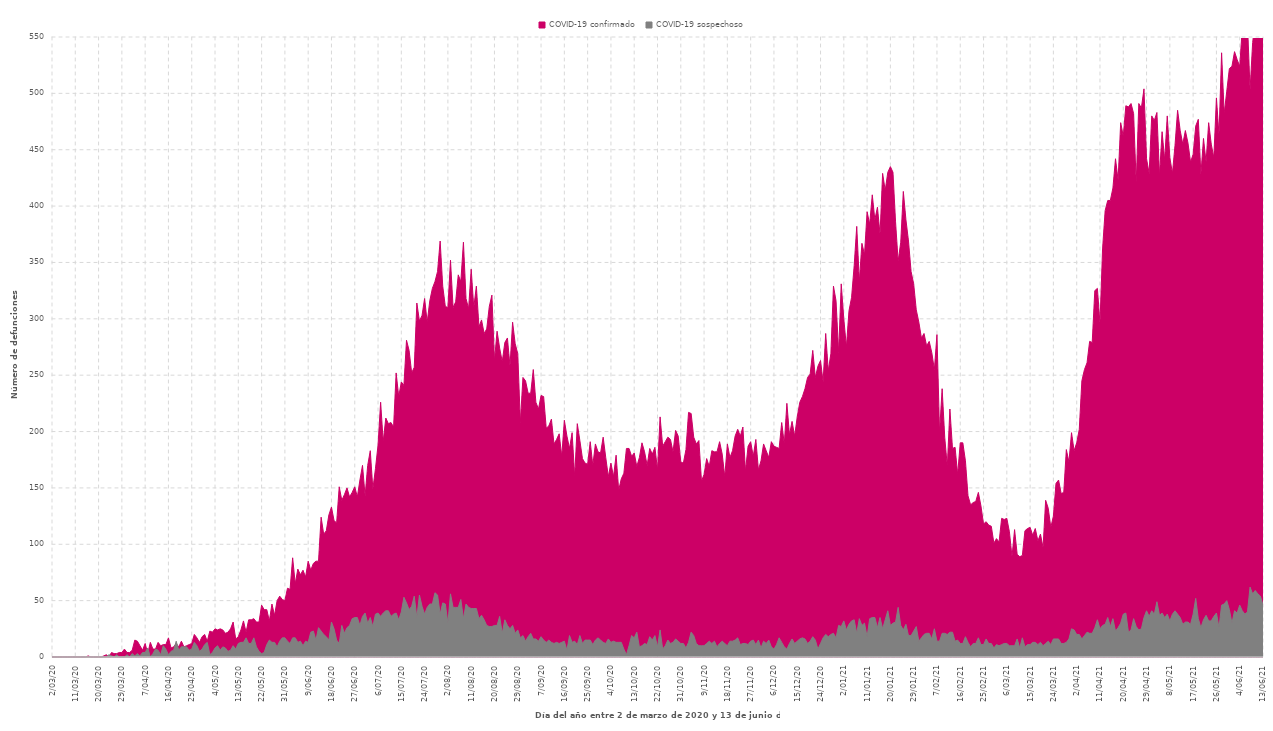
| Category | COVID-19 confirmado | COVID-19 sospechoso |
|---|---|---|
| 2020-03-02 | 0 | 0 |
| 2020-03-03 | 0 | 0 |
| 2020-03-04 | 0 | 0 |
| 2020-03-05 | 0 | 0 |
| 2020-03-06 | 0 | 0 |
| 2020-03-07 | 0 | 0 |
| 2020-03-08 | 0 | 0 |
| 2020-03-09 | 0 | 0 |
| 2020-03-10 | 0 | 0 |
| 2020-03-11 | 0 | 0 |
| 2020-03-12 | 0 | 0 |
| 2020-03-13 | 0 | 0 |
| 2020-03-14 | 0 | 0 |
| 2020-03-15 | 0 | 0 |
| 2020-03-16 | 1 | 0 |
| 2020-03-17 | 0 | 0 |
| 2020-03-18 | 0 | 0 |
| 2020-03-19 | 0 | 0 |
| 2020-03-20 | 0 | 0 |
| 2020-03-21 | 0 | 0 |
| 2020-03-22 | 1 | 0 |
| 2020-03-23 | 2 | 0 |
| 2020-03-24 | 0 | 2 |
| 2020-03-25 | 4 | 1 |
| 2020-03-26 | 3 | 0 |
| 2020-03-27 | 3 | 2 |
| 2020-03-28 | 4 | 0 |
| 2020-03-29 | 4 | 0 |
| 2020-03-30 | 7 | 0 |
| 2020-03-31 | 4 | 2 |
| 2020-04-01 | 4 | 0 |
| 2020-04-02 | 6 | 3 |
| 2020-04-03 | 15 | 1 |
| 2020-04-04 | 14 | 3 |
| 2020-04-05 | 10 | 1 |
| 2020-04-06 | 6 | 4 |
| 2020-04-07 | 12 | 4 |
| 2020-04-08 | 3 | 8 |
| 2020-04-09 | 13 | 0 |
| 2020-04-10 | 7 | 3 |
| 2020-04-11 | 7 | 7 |
| 2020-04-12 | 13 | 6 |
| 2020-04-13 | 10 | 2 |
| 2020-04-14 | 11 | 10 |
| 2020-04-15 | 11 | 7 |
| 2020-04-16 | 17 | 2 |
| 2020-04-17 | 8 | 5 |
| 2020-04-18 | 9 | 6 |
| 2020-04-19 | 12 | 14 |
| 2020-04-20 | 9 | 6 |
| 2020-04-21 | 14 | 9 |
| 2020-04-22 | 9 | 9 |
| 2020-04-23 | 10 | 9 |
| 2020-04-24 | 11 | 6 |
| 2020-04-25 | 12 | 7 |
| 2020-04-26 | 20 | 13 |
| 2020-04-27 | 17 | 10 |
| 2020-04-28 | 13 | 5 |
| 2020-04-29 | 18 | 7 |
| 2020-04-30 | 20 | 11 |
| 2020-05-01 | 14 | 13 |
| 2020-05-02 | 23 | 2 |
| 2020-05-03 | 22 | 4 |
| 2020-05-04 | 25 | 8 |
| 2020-05-05 | 24 | 10 |
| 2020-05-06 | 25 | 6 |
| 2020-05-07 | 24 | 9 |
| 2020-05-08 | 21 | 8 |
| 2020-05-09 | 22 | 5 |
| 2020-05-10 | 25 | 6 |
| 2020-05-11 | 31 | 10 |
| 2020-05-12 | 16 | 7 |
| 2020-05-13 | 18 | 12 |
| 2020-05-14 | 24 | 13 |
| 2020-05-15 | 32 | 13 |
| 2020-05-16 | 22 | 17 |
| 2020-05-17 | 33 | 12 |
| 2020-05-18 | 33 | 12 |
| 2020-05-19 | 34 | 17 |
| 2020-05-20 | 31 | 9 |
| 2020-05-21 | 31 | 5 |
| 2020-05-22 | 46 | 3 |
| 2020-05-23 | 42 | 4 |
| 2020-05-24 | 42 | 11 |
| 2020-05-25 | 32 | 15 |
| 2020-05-26 | 47 | 13 |
| 2020-05-27 | 37 | 13 |
| 2020-05-28 | 50 | 9 |
| 2020-05-29 | 54 | 14 |
| 2020-05-30 | 51 | 17 |
| 2020-05-31 | 50 | 17 |
| 2020-06-01 | 61 | 14 |
| 2020-06-02 | 60 | 12 |
| 2020-06-03 | 88 | 17 |
| 2020-06-04 | 65 | 17 |
| 2020-06-05 | 78 | 13 |
| 2020-06-06 | 73 | 14 |
| 2020-06-07 | 77 | 10 |
| 2020-06-08 | 71 | 14 |
| 2020-06-09 | 85 | 13 |
| 2020-06-10 | 77 | 22 |
| 2020-06-11 | 83 | 23 |
| 2020-06-12 | 85 | 15 |
| 2020-06-13 | 85 | 26 |
| 2020-06-14 | 124 | 23 |
| 2020-06-15 | 109 | 20 |
| 2020-06-16 | 112 | 18 |
| 2020-06-17 | 126 | 15 |
| 2020-06-18 | 133 | 31 |
| 2020-06-19 | 121 | 25 |
| 2020-06-20 | 119 | 15 |
| 2020-06-21 | 151 | 12 |
| 2020-06-22 | 139 | 28 |
| 2020-06-23 | 144 | 21 |
| 2020-06-24 | 150 | 26 |
| 2020-06-25 | 142 | 28 |
| 2020-06-26 | 146 | 34 |
| 2020-06-27 | 151 | 35 |
| 2020-06-28 | 142 | 35 |
| 2020-06-29 | 157 | 28 |
| 2020-06-30 | 170 | 36 |
| 2020-07-01 | 143 | 39 |
| 2020-07-02 | 170 | 30 |
| 2020-07-03 | 183 | 35 |
| 2020-07-04 | 149 | 27 |
| 2020-07-05 | 167 | 38 |
| 2020-07-06 | 188 | 39 |
| 2020-07-07 | 226 | 36 |
| 2020-07-08 | 191 | 39 |
| 2020-07-09 | 212 | 41 |
| 2020-07-10 | 207 | 41 |
| 2020-07-11 | 208 | 36 |
| 2020-07-12 | 204 | 38 |
| 2020-07-13 | 252 | 39 |
| 2020-07-14 | 231 | 33 |
| 2020-07-15 | 244 | 40 |
| 2020-07-16 | 241 | 53 |
| 2020-07-17 | 281 | 48 |
| 2020-07-18 | 272 | 42 |
| 2020-07-19 | 252 | 45 |
| 2020-07-20 | 257 | 54 |
| 2020-07-21 | 314 | 35 |
| 2020-07-22 | 298 | 55 |
| 2020-07-23 | 303 | 45 |
| 2020-07-24 | 318 | 38 |
| 2020-07-25 | 297 | 44 |
| 2020-07-26 | 316 | 47 |
| 2020-07-27 | 327 | 47 |
| 2020-07-28 | 333 | 57 |
| 2020-07-29 | 342 | 55 |
| 2020-07-30 | 369 | 38 |
| 2020-07-31 | 329 | 48 |
| 2020-08-01 | 311 | 47 |
| 2020-08-02 | 310 | 30 |
| 2020-08-03 | 352 | 56 |
| 2020-08-04 | 310 | 44 |
| 2020-08-05 | 315 | 44 |
| 2020-08-06 | 339 | 44 |
| 2020-08-07 | 333 | 51 |
| 2020-08-08 | 368 | 34 |
| 2020-08-09 | 318 | 47 |
| 2020-08-10 | 309 | 44 |
| 2020-08-11 | 344 | 43 |
| 2020-08-12 | 310 | 43 |
| 2020-08-13 | 329 | 43 |
| 2020-08-14 | 293 | 34 |
| 2020-08-15 | 299 | 37 |
| 2020-08-16 | 287 | 33 |
| 2020-08-17 | 291 | 28 |
| 2020-08-18 | 311 | 27 |
| 2020-08-19 | 321 | 27 |
| 2020-08-20 | 263 | 28 |
| 2020-08-21 | 289 | 28 |
| 2020-08-22 | 274 | 36 |
| 2020-08-23 | 262 | 21 |
| 2020-08-24 | 279 | 33 |
| 2020-08-25 | 283 | 28 |
| 2020-08-26 | 258 | 25 |
| 2020-08-27 | 297 | 28 |
| 2020-08-28 | 278 | 21 |
| 2020-08-29 | 269 | 24 |
| 2020-08-30 | 208 | 17 |
| 2020-08-31 | 248 | 19 |
| 2020-09-01 | 245 | 14 |
| 2020-09-02 | 234 | 18 |
| 2020-09-03 | 234 | 21 |
| 2020-09-04 | 255 | 16 |
| 2020-09-05 | 226 | 16 |
| 2020-09-06 | 220 | 14 |
| 2020-09-07 | 232 | 18 |
| 2020-09-08 | 231 | 15 |
| 2020-09-09 | 203 | 13 |
| 2020-09-10 | 205 | 15 |
| 2020-09-11 | 211 | 13 |
| 2020-09-12 | 189 | 12 |
| 2020-09-13 | 193 | 13 |
| 2020-09-14 | 198 | 12 |
| 2020-09-15 | 178 | 13 |
| 2020-09-16 | 210 | 14 |
| 2020-09-17 | 196 | 6 |
| 2020-09-18 | 185 | 19 |
| 2020-09-19 | 199 | 13 |
| 2020-09-20 | 160 | 14 |
| 2020-09-21 | 207 | 11 |
| 2020-09-22 | 192 | 19 |
| 2020-09-23 | 176 | 12 |
| 2020-09-24 | 172 | 15 |
| 2020-09-25 | 171 | 15 |
| 2020-09-26 | 191 | 15 |
| 2020-09-27 | 170 | 11 |
| 2020-09-28 | 189 | 15 |
| 2020-09-29 | 182 | 17 |
| 2020-09-30 | 181 | 15 |
| 2020-10-01 | 195 | 13 |
| 2020-10-02 | 177 | 12 |
| 2020-10-03 | 160 | 16 |
| 2020-10-04 | 172 | 13 |
| 2020-10-05 | 160 | 14 |
| 2020-10-06 | 179 | 13 |
| 2020-10-07 | 148 | 13 |
| 2020-10-08 | 158 | 13 |
| 2020-10-09 | 163 | 7 |
| 2020-10-10 | 185 | 2 |
| 2020-10-11 | 185 | 10 |
| 2020-10-12 | 178 | 19 |
| 2020-10-13 | 181 | 17 |
| 2020-10-14 | 169 | 22 |
| 2020-10-15 | 177 | 9 |
| 2020-10-16 | 190 | 10 |
| 2020-10-17 | 182 | 12 |
| 2020-10-18 | 170 | 11 |
| 2020-10-19 | 185 | 18 |
| 2020-10-20 | 180 | 15 |
| 2020-10-21 | 186 | 19 |
| 2020-10-22 | 166 | 9 |
| 2020-10-23 | 213 | 24 |
| 2020-10-24 | 187 | 7 |
| 2020-10-25 | 191 | 10 |
| 2020-10-26 | 195 | 15 |
| 2020-10-27 | 193 | 12 |
| 2020-10-28 | 182 | 13 |
| 2020-10-29 | 201 | 16 |
| 2020-10-30 | 196 | 14 |
| 2020-10-31 | 173 | 12 |
| 2020-11-01 | 172 | 12 |
| 2020-11-02 | 184 | 8 |
| 2020-11-03 | 217 | 13 |
| 2020-11-04 | 216 | 22 |
| 2020-11-05 | 195 | 19 |
| 2020-11-06 | 189 | 12 |
| 2020-11-07 | 192 | 10 |
| 2020-11-08 | 156 | 10 |
| 2020-11-09 | 162 | 10 |
| 2020-11-10 | 176 | 12 |
| 2020-11-11 | 169 | 14 |
| 2020-11-12 | 183 | 12 |
| 2020-11-13 | 182 | 14 |
| 2020-11-14 | 182 | 9 |
| 2020-11-15 | 191 | 12 |
| 2020-11-16 | 180 | 14 |
| 2020-11-17 | 160 | 12 |
| 2020-11-18 | 189 | 10 |
| 2020-11-19 | 177 | 14 |
| 2020-11-20 | 183 | 14 |
| 2020-11-21 | 196 | 15 |
| 2020-11-22 | 202 | 17 |
| 2020-11-23 | 196 | 11 |
| 2020-11-24 | 204 | 12 |
| 2020-11-25 | 165 | 12 |
| 2020-11-26 | 187 | 11 |
| 2020-11-27 | 191 | 14 |
| 2020-11-28 | 178 | 15 |
| 2020-11-29 | 193 | 11 |
| 2020-11-30 | 166 | 15 |
| 2020-12-01 | 174 | 8 |
| 2020-12-02 | 189 | 14 |
| 2020-12-03 | 183 | 12 |
| 2020-12-04 | 177 | 15 |
| 2020-12-05 | 191 | 9 |
| 2020-12-06 | 187 | 7 |
| 2020-12-07 | 186 | 11 |
| 2020-12-08 | 185 | 17 |
| 2020-12-09 | 208 | 13 |
| 2020-12-10 | 189 | 9 |
| 2020-12-11 | 225 | 7 |
| 2020-12-12 | 197 | 12 |
| 2020-12-13 | 209 | 16 |
| 2020-12-14 | 196 | 12 |
| 2020-12-15 | 213 | 14 |
| 2020-12-16 | 226 | 16 |
| 2020-12-17 | 231 | 17 |
| 2020-12-18 | 238 | 16 |
| 2020-12-19 | 248 | 12 |
| 2020-12-20 | 251 | 14 |
| 2020-12-21 | 272 | 18 |
| 2020-12-22 | 248 | 15 |
| 2020-12-23 | 258 | 7 |
| 2020-12-24 | 263 | 12 |
| 2020-12-25 | 244 | 17 |
| 2020-12-26 | 287 | 20 |
| 2020-12-27 | 254 | 18 |
| 2020-12-28 | 269 | 20 |
| 2020-12-29 | 329 | 21 |
| 2020-12-30 | 316 | 17 |
| 2020-12-31 | 270 | 28 |
| 2021-01-01 | 331 | 27 |
| 2021-01-02 | 300 | 32 |
| 2021-01-03 | 275 | 24 |
| 2021-01-04 | 307 | 29 |
| 2021-01-05 | 319 | 32 |
| 2021-01-06 | 347 | 33 |
| 2021-01-07 | 382 | 21 |
| 2021-01-08 | 333 | 34 |
| 2021-01-09 | 367 | 28 |
| 2021-01-10 | 357 | 30 |
| 2021-01-11 | 395 | 18 |
| 2021-01-12 | 384 | 34 |
| 2021-01-13 | 410 | 35 |
| 2021-01-14 | 388 | 35 |
| 2021-01-15 | 399 | 26 |
| 2021-01-16 | 375 | 35 |
| 2021-01-17 | 429 | 25 |
| 2021-01-18 | 414 | 33 |
| 2021-01-19 | 430 | 41 |
| 2021-01-20 | 435 | 28 |
| 2021-01-21 | 430 | 30 |
| 2021-01-22 | 386 | 31 |
| 2021-01-23 | 351 | 44 |
| 2021-01-24 | 368 | 28 |
| 2021-01-25 | 413 | 24 |
| 2021-01-26 | 388 | 29 |
| 2021-01-27 | 369 | 19 |
| 2021-01-28 | 342 | 19 |
| 2021-01-29 | 331 | 23 |
| 2021-01-30 | 308 | 27 |
| 2021-01-31 | 297 | 14 |
| 2021-02-01 | 283 | 17 |
| 2021-02-02 | 287 | 20 |
| 2021-02-03 | 276 | 21 |
| 2021-02-04 | 280 | 21 |
| 2021-02-05 | 270 | 16 |
| 2021-02-06 | 255 | 25 |
| 2021-02-07 | 286 | 14 |
| 2021-02-08 | 199 | 14 |
| 2021-02-09 | 238 | 21 |
| 2021-02-10 | 195 | 21 |
| 2021-02-11 | 169 | 20 |
| 2021-02-12 | 220 | 22 |
| 2021-02-13 | 185 | 22 |
| 2021-02-14 | 186 | 14 |
| 2021-02-15 | 162 | 15 |
| 2021-02-16 | 190 | 12 |
| 2021-02-17 | 190 | 12 |
| 2021-02-18 | 174 | 18 |
| 2021-02-19 | 143 | 13 |
| 2021-02-20 | 135 | 9 |
| 2021-02-21 | 137 | 12 |
| 2021-02-22 | 138 | 12 |
| 2021-02-23 | 146 | 17 |
| 2021-02-24 | 134 | 11 |
| 2021-02-25 | 118 | 11 |
| 2021-02-26 | 120 | 16 |
| 2021-02-27 | 117 | 12 |
| 2021-02-28 | 116 | 12 |
| 2021-03-01 | 101 | 8 |
| 2021-03-02 | 105 | 11 |
| 2021-03-03 | 102 | 10 |
| 2021-03-04 | 123 | 11 |
| 2021-03-05 | 122 | 12 |
| 2021-03-06 | 123 | 12 |
| 2021-03-07 | 111 | 10 |
| 2021-03-08 | 89 | 10 |
| 2021-03-09 | 113 | 10 |
| 2021-03-10 | 91 | 16 |
| 2021-03-11 | 89 | 8 |
| 2021-03-12 | 90 | 17 |
| 2021-03-13 | 112 | 9 |
| 2021-03-14 | 114 | 11 |
| 2021-03-15 | 115 | 11 |
| 2021-03-16 | 108 | 13 |
| 2021-03-17 | 114 | 13 |
| 2021-03-18 | 103 | 11 |
| 2021-03-19 | 109 | 13 |
| 2021-03-20 | 97 | 10 |
| 2021-03-21 | 139 | 12 |
| 2021-03-22 | 132 | 14 |
| 2021-03-23 | 115 | 11 |
| 2021-03-24 | 125 | 16 |
| 2021-03-25 | 154 | 16 |
| 2021-03-26 | 157 | 16 |
| 2021-03-27 | 145 | 12 |
| 2021-03-28 | 146 | 12 |
| 2021-03-29 | 184 | 13 |
| 2021-03-30 | 173 | 16 |
| 2021-03-31 | 199 | 25 |
| 2021-04-01 | 183 | 24 |
| 2021-04-02 | 190 | 20 |
| 2021-04-03 | 202 | 20 |
| 2021-04-04 | 245 | 16 |
| 2021-04-05 | 255 | 19 |
| 2021-04-06 | 261 | 22 |
| 2021-04-07 | 280 | 21 |
| 2021-04-08 | 279 | 21 |
| 2021-04-09 | 325 | 26 |
| 2021-04-10 | 327 | 33 |
| 2021-04-11 | 296 | 25 |
| 2021-04-12 | 362 | 28 |
| 2021-04-13 | 396 | 29 |
| 2021-04-14 | 405 | 35 |
| 2021-04-15 | 405 | 27 |
| 2021-04-16 | 416 | 34 |
| 2021-04-17 | 442 | 23 |
| 2021-04-18 | 423 | 26 |
| 2021-04-19 | 474 | 30 |
| 2021-04-20 | 462 | 38 |
| 2021-04-21 | 489 | 39 |
| 2021-04-22 | 488 | 22 |
| 2021-04-23 | 491 | 24 |
| 2021-04-24 | 482 | 34 |
| 2021-04-25 | 420 | 27 |
| 2021-04-26 | 491 | 24 |
| 2021-04-27 | 487 | 25 |
| 2021-04-28 | 504 | 35 |
| 2021-04-29 | 442 | 41 |
| 2021-04-30 | 429 | 36 |
| 2021-05-01 | 480 | 41 |
| 2021-05-02 | 476 | 38 |
| 2021-05-03 | 483 | 49 |
| 2021-05-04 | 427 | 37 |
| 2021-05-05 | 466 | 39 |
| 2021-05-06 | 441 | 35 |
| 2021-05-07 | 480 | 38 |
| 2021-05-08 | 443 | 32 |
| 2021-05-09 | 429 | 38 |
| 2021-05-10 | 454 | 41 |
| 2021-05-11 | 485 | 38 |
| 2021-05-12 | 467 | 35 |
| 2021-05-13 | 455 | 29 |
| 2021-05-14 | 467 | 31 |
| 2021-05-15 | 456 | 31 |
| 2021-05-16 | 439 | 29 |
| 2021-05-17 | 446 | 38 |
| 2021-05-18 | 471 | 52 |
| 2021-05-19 | 477 | 34 |
| 2021-05-20 | 428 | 26 |
| 2021-05-21 | 460 | 33 |
| 2021-05-22 | 439 | 37 |
| 2021-05-23 | 474 | 32 |
| 2021-05-24 | 455 | 32 |
| 2021-05-25 | 443 | 36 |
| 2021-05-26 | 496 | 39 |
| 2021-05-27 | 463 | 26 |
| 2021-05-28 | 536 | 46 |
| 2021-05-29 | 482 | 47 |
| 2021-05-30 | 502 | 50 |
| 2021-05-31 | 522 | 42 |
| 2021-06-01 | 524 | 30 |
| 2021-06-02 | 537 | 41 |
| 2021-06-03 | 530 | 39 |
| 2021-06-04 | 524 | 46 |
| 2021-06-05 | 558 | 41 |
| 2021-06-06 | 552 | 38 |
| 2021-06-07 | 562 | 40 |
| 2021-06-08 | 503 | 62 |
| 2021-06-09 | 545 | 56 |
| 2021-06-10 | 565 | 59 |
| 2021-06-11 | 580 | 56 |
| 2021-06-12 | 569 | 54 |
| 2021-06-13 | 578 | 46 |